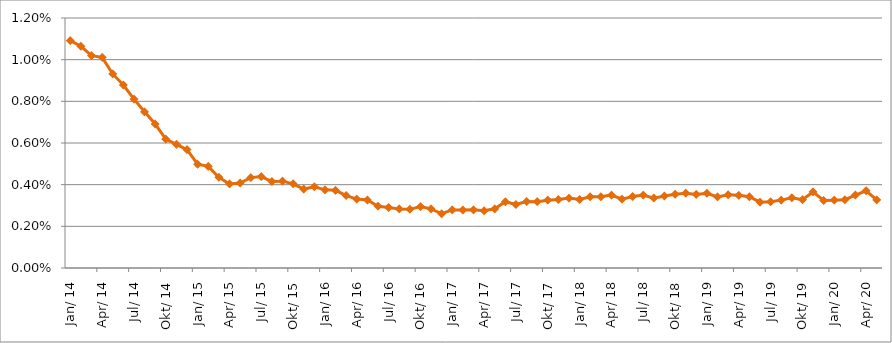
| Category | Durchschnittszins |
|---|---|
| 2014-01-01 | 0.011 |
| 2014-02-01 | 0.011 |
| 2014-03-01 | 0.01 |
| 2014-04-01 | 0.01 |
| 2014-05-01 | 0.009 |
| 2014-06-01 | 0.009 |
| 2014-07-01 | 0.008 |
| 2014-08-01 | 0.007 |
| 2014-09-01 | 0.007 |
| 2014-10-01 | 0.006 |
| 2014-11-01 | 0.006 |
| 2014-12-01 | 0.006 |
| 2015-01-01 | 0.005 |
| 2015-02-01 | 0.005 |
| 2015-03-01 | 0.004 |
| 2015-04-01 | 0.004 |
| 2015-05-01 | 0.004 |
| 2015-06-01 | 0.004 |
| 2015-07-01 | 0.004 |
| 2015-08-01 | 0.004 |
| 2015-09-01 | 0.004 |
| 2015-10-01 | 0.004 |
| 2015-11-01 | 0.004 |
| 2015-12-01 | 0.004 |
| 2016-01-01 | 0.004 |
| 2016-02-01 | 0.004 |
| 2016-03-01 | 0.003 |
| 2016-04-01 | 0.003 |
| 2016-05-01 | 0.003 |
| 2016-06-01 | 0.003 |
| 2016-07-01 | 0.003 |
| 2016-08-01 | 0.003 |
| 2016-09-01 | 0.003 |
| 2016-10-01 | 0.003 |
| 2016-11-01 | 0.003 |
| 2016-12-01 | 0.003 |
| 2017-01-01 | 0.003 |
| 2017-02-01 | 0.003 |
| 2017-03-01 | 0.003 |
| 2017-04-01 | 0.003 |
| 2017-05-01 | 0.003 |
| 2017-06-01 | 0.003 |
| 2017-07-01 | 0.003 |
| 2017-08-01 | 0.003 |
| 2017-09-01 | 0.003 |
| 2017-10-01 | 0.003 |
| 2017-11-01 | 0.003 |
| 2017-12-01 | 0.003 |
| 2018-01-01 | 0.003 |
| 2018-02-01 | 0.003 |
| 2018-03-01 | 0.003 |
| 2018-04-01 | 0.003 |
| 2018-05-01 | 0.003 |
| 2018-06-01 | 0.003 |
| 2018-07-01 | 0.004 |
| 2018-08-01 | 0.003 |
| 2018-09-01 | 0.003 |
| 2018-10-01 | 0.004 |
| 2018-11-01 | 0.004 |
| 2018-12-01 | 0.004 |
| 2019-01-01 | 0.004 |
| 2019-02-01 | 0.003 |
| 2019-03-01 | 0.004 |
| 2019-04-01 | 0.003 |
| 2019-05-01 | 0.003 |
| 2019-06-01 | 0.003 |
| 2019-07-01 | 0.003 |
| 2019-08-01 | 0.003 |
| 2019-09-01 | 0.003 |
| 2019-10-01 | 0.003 |
| 2019-11-01 | 0.004 |
| 2019-12-01 | 0.003 |
| 2020-01-01 | 0.003 |
| 2020-02-01 | 0.003 |
| 2020-03-01 | 0.004 |
| 2020-04-01 | 0.004 |
| 2020-05-01 | 0.003 |